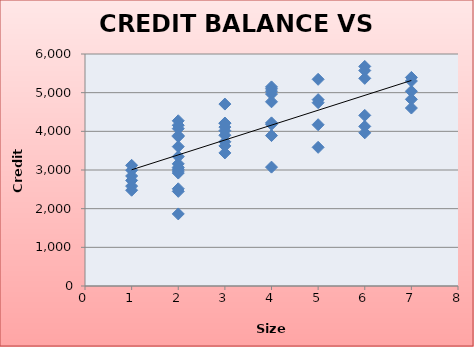
| Category | Credit 
Balance ($) |
|---|---|
| 3.0 | 4016 |
| 2.0 | 3159 |
| 4.0 | 5100 |
| 5.0 | 4742 |
| 2.0 | 1864 |
| 2.0 | 4070 |
| 1.0 | 2731 |
| 2.0 | 3348 |
| 4.0 | 4764 |
| 3.0 | 4110 |
| 3.0 | 4208 |
| 4.0 | 4219 |
| 1.0 | 2477 |
| 2.0 | 2514 |
| 3.0 | 4214 |
| 4.0 | 4965 |
| 6.0 | 4412 |
| 2.0 | 2448 |
| 1.0 | 2995 |
| 5.0 | 4171 |
| 6.0 | 5678 |
| 3.0 | 3623 |
| 7.0 | 5301 |
| 2.0 | 3020 |
| 7.0 | 4828 |
| 6.0 | 5573 |
| 1.0 | 2583 |
| 2.0 | 3866 |
| 5.0 | 3586 |
| 4.0 | 5037 |
| 2.0 | 3605 |
| 5.0 | 5345 |
| 6.0 | 5370 |
| 2.0 | 3890 |
| 3.0 | 4705 |
| 2.0 | 4157 |
| 3.0 | 3899 |
| 4.0 | 3890 |
| 2.0 | 2972 |
| 1.0 | 3121 |
| 4.0 | 4183 |
| 3.0 | 3730 |
| 6.0 | 4127 |
| 2.0 | 2921 |
| 7.0 | 4603 |
| 2.0 | 4273 |
| 2.0 | 3067 |
| 4.0 | 3074 |
| 5.0 | 4820 |
| 4.0 | 5149 |
| 1.0 | 2845 |
| 6.0 | 3962 |
| 7.0 | 5394 |
| 3.0 | 3442 |
| 7.0 | 5036 |